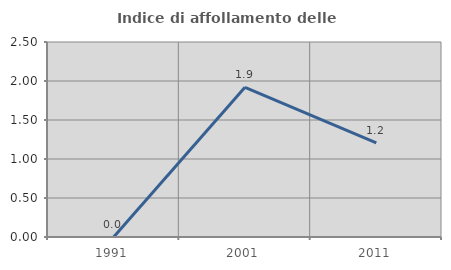
| Category | Indice di affollamento delle abitazioni  |
|---|---|
| 1991.0 | 0 |
| 2001.0 | 1.918 |
| 2011.0 | 1.207 |